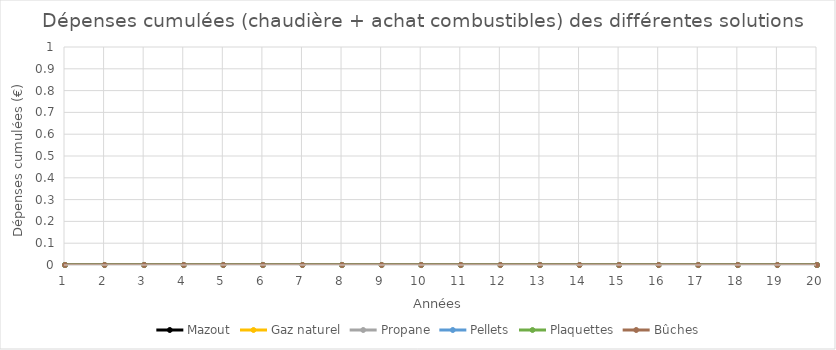
| Category | Mazout | Gaz naturel | Propane | Pellets | Plaquettes | Bûches |
|---|---|---|---|---|---|---|
| 1.0 | 0 | 0 | 0 | 0 | 0 | 0 |
| 2.0 | 0 | 0 | 0 | 0 | 0 | 0 |
| 3.0 | 0 | 0 | 0 | 0 | 0 | 0 |
| 4.0 | 0 | 0 | 0 | 0 | 0 | 0 |
| 5.0 | 0 | 0 | 0 | 0 | 0 | 0 |
| 6.0 | 0 | 0 | 0 | 0 | 0 | 0 |
| 7.0 | 0 | 0 | 0 | 0 | 0 | 0 |
| 8.0 | 0 | 0 | 0 | 0 | 0 | 0 |
| 9.0 | 0 | 0 | 0 | 0 | 0 | 0 |
| 10.0 | 0 | 0 | 0 | 0 | 0 | 0 |
| 11.0 | 0 | 0 | 0 | 0 | 0 | 0 |
| 12.0 | 0 | 0 | 0 | 0 | 0 | 0 |
| 13.0 | 0 | 0 | 0 | 0 | 0 | 0 |
| 14.0 | 0 | 0 | 0 | 0 | 0 | 0 |
| 15.0 | 0 | 0 | 0 | 0 | 0 | 0 |
| 16.0 | 0 | 0 | 0 | 0 | 0 | 0 |
| 17.0 | 0 | 0 | 0 | 0 | 0 | 0 |
| 18.0 | 0 | 0 | 0 | 0 | 0 | 0 |
| 19.0 | 0 | 0 | 0 | 0 | 0 | 0 |
| 20.0 | 0 | 0 | 0 | 0 | 0 | 0 |